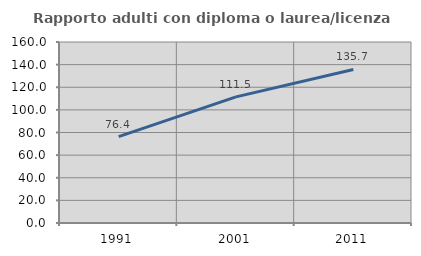
| Category | Rapporto adulti con diploma o laurea/licenza media  |
|---|---|
| 1991.0 | 76.364 |
| 2001.0 | 111.504 |
| 2011.0 | 135.746 |